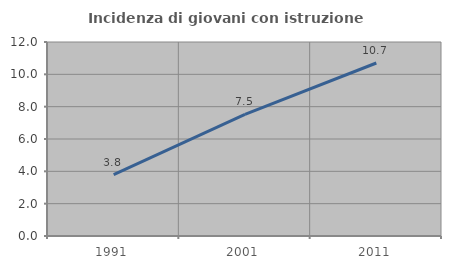
| Category | Incidenza di giovani con istruzione universitaria |
|---|---|
| 1991.0 | 3.8 |
| 2001.0 | 7.52 |
| 2011.0 | 10.7 |